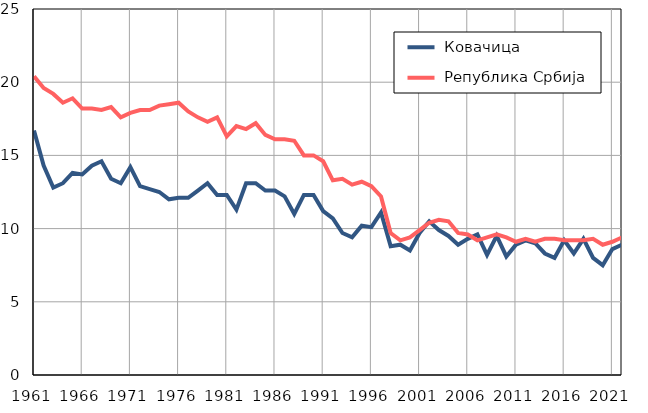
| Category |  Ковачица |  Република Србија |
|---|---|---|
| 1961.0 | 16.7 | 20.4 |
| 1962.0 | 14.3 | 19.6 |
| 1963.0 | 12.8 | 19.2 |
| 1964.0 | 13.1 | 18.6 |
| 1965.0 | 13.8 | 18.9 |
| 1966.0 | 13.7 | 18.2 |
| 1967.0 | 14.3 | 18.2 |
| 1968.0 | 14.6 | 18.1 |
| 1969.0 | 13.4 | 18.3 |
| 1970.0 | 13.1 | 17.6 |
| 1971.0 | 14.2 | 17.9 |
| 1972.0 | 12.9 | 18.1 |
| 1973.0 | 12.7 | 18.1 |
| 1974.0 | 12.5 | 18.4 |
| 1975.0 | 12 | 18.5 |
| 1976.0 | 12.1 | 18.6 |
| 1977.0 | 12.1 | 18 |
| 1978.0 | 12.6 | 17.6 |
| 1979.0 | 13.1 | 17.3 |
| 1980.0 | 12.3 | 17.6 |
| 1981.0 | 12.3 | 16.3 |
| 1982.0 | 11.3 | 17 |
| 1983.0 | 13.1 | 16.8 |
| 1984.0 | 13.1 | 17.2 |
| 1985.0 | 12.6 | 16.4 |
| 1986.0 | 12.6 | 16.1 |
| 1987.0 | 12.2 | 16.1 |
| 1988.0 | 11 | 16 |
| 1989.0 | 12.3 | 15 |
| 1990.0 | 12.3 | 15 |
| 1991.0 | 11.2 | 14.6 |
| 1992.0 | 10.7 | 13.3 |
| 1993.0 | 9.7 | 13.4 |
| 1994.0 | 9.4 | 13 |
| 1995.0 | 10.2 | 13.2 |
| 1996.0 | 10.1 | 12.9 |
| 1997.0 | 11.1 | 12.2 |
| 1998.0 | 8.8 | 9.7 |
| 1999.0 | 8.9 | 9.2 |
| 2000.0 | 8.5 | 9.4 |
| 2001.0 | 9.7 | 9.9 |
| 2002.0 | 10.5 | 10.4 |
| 2003.0 | 9.9 | 10.6 |
| 2004.0 | 9.5 | 10.5 |
| 2005.0 | 8.9 | 9.7 |
| 2006.0 | 9.3 | 9.6 |
| 2007.0 | 9.6 | 9.2 |
| 2008.0 | 8.2 | 9.4 |
| 2009.0 | 9.5 | 9.6 |
| 2010.0 | 8.1 | 9.4 |
| 2011.0 | 8.9 | 9.1 |
| 2012.0 | 9.2 | 9.3 |
| 2013.0 | 9 | 9.1 |
| 2014.0 | 8.3 | 9.3 |
| 2015.0 | 8 | 9.3 |
| 2016.0 | 9.2 | 9.2 |
| 2017.0 | 8.3 | 9.2 |
| 2018.0 | 9.3 | 9.2 |
| 2019.0 | 8 | 9.3 |
| 2020.0 | 7.5 | 8.9 |
| 2021.0 | 8.6 | 9.1 |
| 2022.0 | 8.9 | 9.4 |